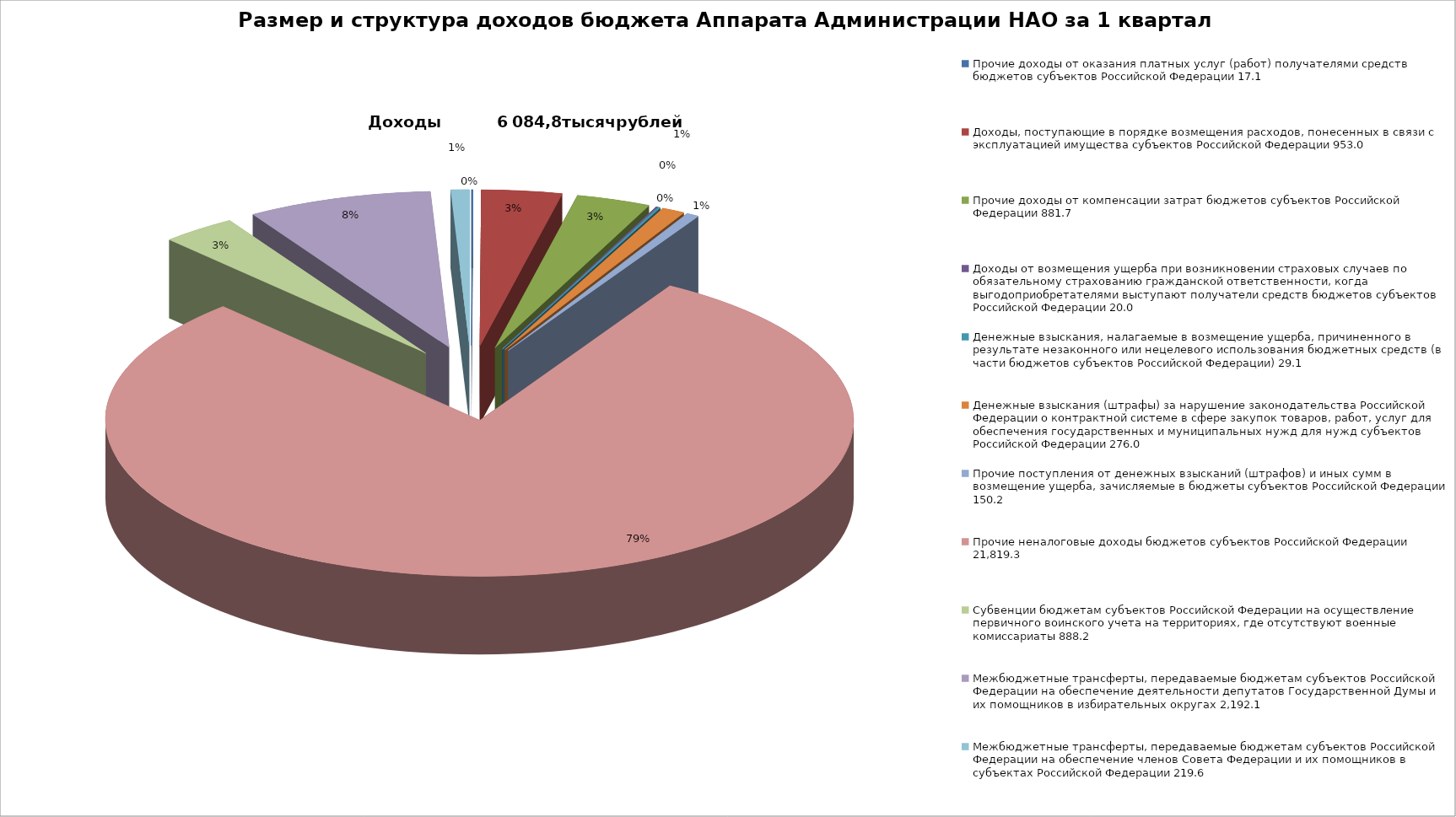
| Category | Размер и структура доходов бюджета Аппарата Администрации НАО за 1 квартал 2018 г. |
|---|---|
| 0 | 17.1 |
| 1 | 953 |
| 2 | 881.7 |
| 3 | 20 |
| 4 | 29.1 |
| 5 | 276 |
| 6 | 150.2 |
| 7 | 21819.3 |
| 8 | 888.2 |
| 9 | 2192.1 |
| 10 | 219.6 |